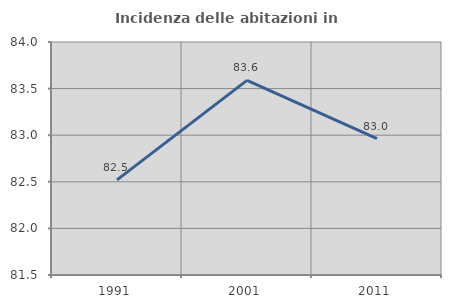
| Category | Incidenza delle abitazioni in proprietà  |
|---|---|
| 1991.0 | 82.52 |
| 2001.0 | 83.588 |
| 2011.0 | 82.963 |